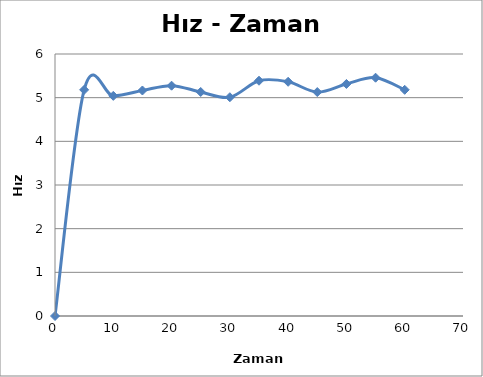
| Category | Hız |
|---|---|
| 0.0 | 0 |
| 5.0 | 5.179 |
| 10.0 | 5.041 |
| 15.0 | 5.164 |
| 20.0 | 5.274 |
| 25.0 | 5.13 |
| 30.0 | 5.01 |
| 35.0 | 5.388 |
| 40.0 | 5.364 |
| 45.0 | 5.128 |
| 50.0 | 5.314 |
| 55.0 | 5.457 |
| 60.0 | 5.18 |